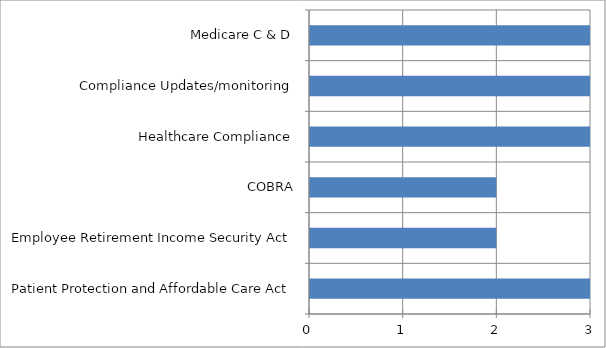
| Category | Series 0 |
|---|---|
| Patient Protection and Affordable Care Act | 3 |
| Employee Retirement Income Security Act | 2 |
| COBRA | 2 |
| Healthcare Compliance | 3 |
| Compliance Updates/monitoring | 3 |
| Medicare C & D | 3 |